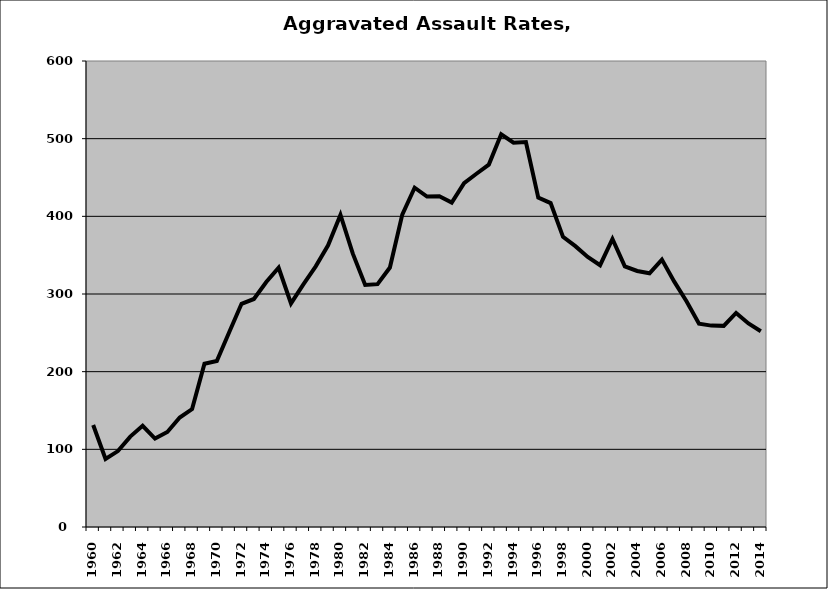
| Category | Aggravated Assault |
|---|---|
| 1960.0 | 131.397 |
| 1961.0 | 87.563 |
| 1962.0 | 97.747 |
| 1963.0 | 116.421 |
| 1964.0 | 130.234 |
| 1965.0 | 113.868 |
| 1966.0 | 122.373 |
| 1967.0 | 141.004 |
| 1968.0 | 151.856 |
| 1969.0 | 210.159 |
| 1970.0 | 213.712 |
| 1971.0 | 250.676 |
| 1972.0 | 287.352 |
| 1973.0 | 293.586 |
| 1974.0 | 315.513 |
| 1975.0 | 333.813 |
| 1976.0 | 287.885 |
| 1977.0 | 312.326 |
| 1978.0 | 335.599 |
| 1979.0 | 362.612 |
| 1980.0 | 401.752 |
| 1981.0 | 351.951 |
| 1982.0 | 311.608 |
| 1983.0 | 312.69 |
| 1984.0 | 334.065 |
| 1985.0 | 402.259 |
| 1986.0 | 436.81 |
| 1987.0 | 425.458 |
| 1988.0 | 425.793 |
| 1989.0 | 417.688 |
| 1990.0 | 442.81 |
| 1991.0 | 454.827 |
| 1992.0 | 466.597 |
| 1993.0 | 505.666 |
| 1994.0 | 494.748 |
| 1995.0 | 495.709 |
| 1996.0 | 424.029 |
| 1997.0 | 417.058 |
| 1998.0 | 373.57 |
| 1999.0 | 361.612 |
| 2000.0 | 347.735 |
| 2001.0 | 337.085 |
| 2002.0 | 370.806 |
| 2003.0 | 335.567 |
| 2004.0 | 329.641 |
| 2005.0 | 326.692 |
| 2006.0 | 344.355 |
| 2007.0 | 315.898 |
| 2008.0 | 290.336 |
| 2009.0 | 261.834 |
| 2010.0 | 259.292 |
| 2011.0 | 258.964 |
| 2012.0 | 275.585 |
| 2013.0 | 262.11 |
| 2014.0 | 252.099 |